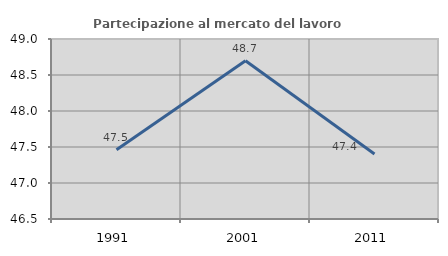
| Category | Partecipazione al mercato del lavoro  femminile |
|---|---|
| 1991.0 | 47.462 |
| 2001.0 | 48.698 |
| 2011.0 | 47.403 |